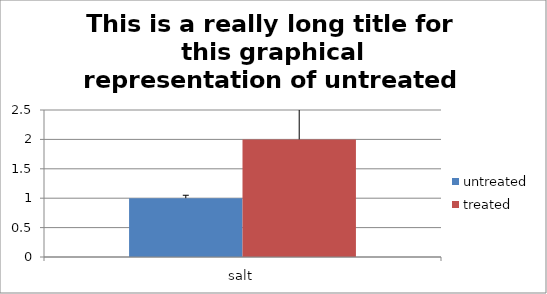
| Category | untreated | treated |
|---|---|---|
| salt | 1 | 2 |